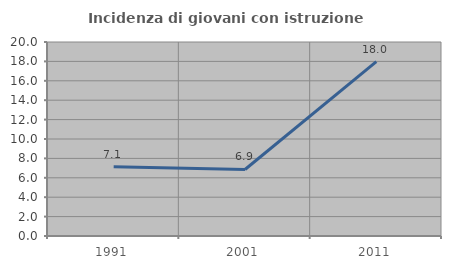
| Category | Incidenza di giovani con istruzione universitaria |
|---|---|
| 1991.0 | 7.143 |
| 2001.0 | 6.857 |
| 2011.0 | 17.982 |